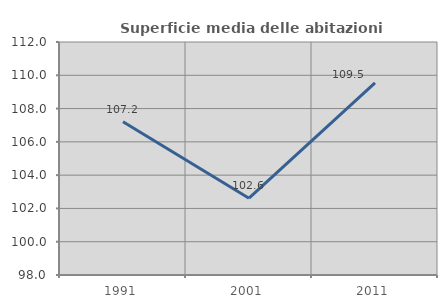
| Category | Superficie media delle abitazioni occupate |
|---|---|
| 1991.0 | 107.206 |
| 2001.0 | 102.616 |
| 2011.0 | 109.543 |